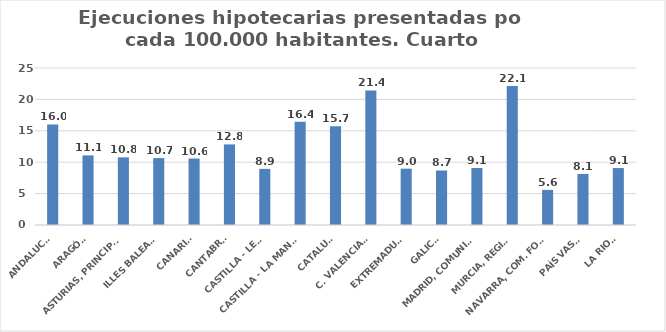
| Category | Series 0 |
|---|---|
| ANDALUCÍA | 16.014 |
| ARAGÓN | 11.084 |
| ASTURIAS, PRINCIPADO | 10.773 |
| ILLES BALEARS | 10.656 |
| CANARIAS | 10.585 |
| CANTABRIA | 12.831 |
| CASTILLA - LEÓN | 8.938 |
| CASTILLA - LA MANCHA | 16.443 |
| CATALUÑA | 15.728 |
| C. VALENCIANA | 21.431 |
| EXTREMADURA | 8.966 |
| GALICIA | 8.681 |
| MADRID, COMUNIDAD | 9.08 |
| MURCIA, REGIÓN | 22.127 |
| NAVARRA, COM. FORAL | 5.593 |
| PAÍS VASCO | 8.13 |
| LA RIOJA | 9.068 |